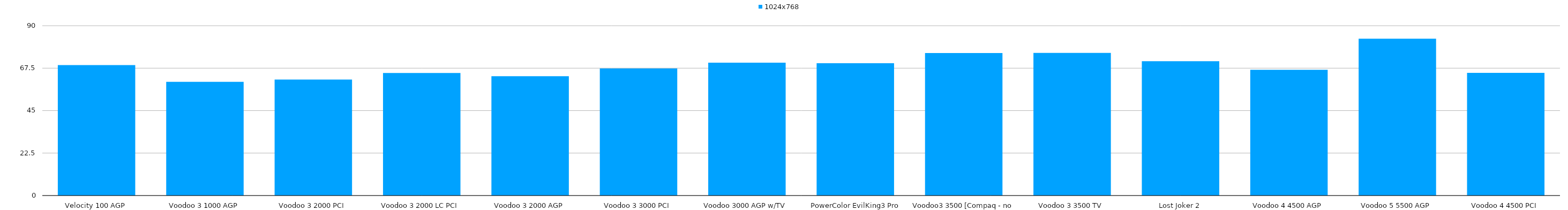
| Category | 1024x768 |
|---|---|
| Velocity 100 AGP | 69.13 |
| Voodoo 3 1000 AGP | 60.247 |
| Voodoo 3 2000 PCI | 61.5 |
| Voodoo 3 2000 LC PCI | 64.977 |
| Voodoo 3 2000 AGP | 63.26 |
| Voodoo 3 3000 PCI | 67.337 |
| Voodoo 3000 AGP w/TV | 70.421 |
| PowerColor EvilKing3 Pro AGP  | 70.138 |
| Voodoo3 3500 [Compaq - no tuner] | 75.534 |
| Voodoo 3 3500 TV | 75.608 |
| Lost Joker 2 | 71.223 |
| Voodoo 4 4500 AGP | 66.649 |
| Voodoo 5 5500 AGP | 83.096 |
| Voodoo 4 4500 PCI | 65.041 |